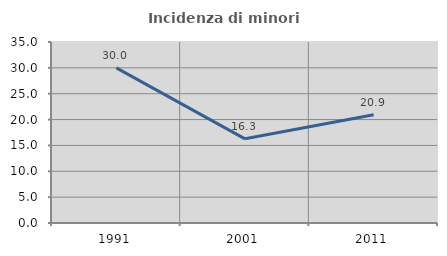
| Category | Incidenza di minori stranieri |
|---|---|
| 1991.0 | 30 |
| 2001.0 | 16.279 |
| 2011.0 | 20.93 |